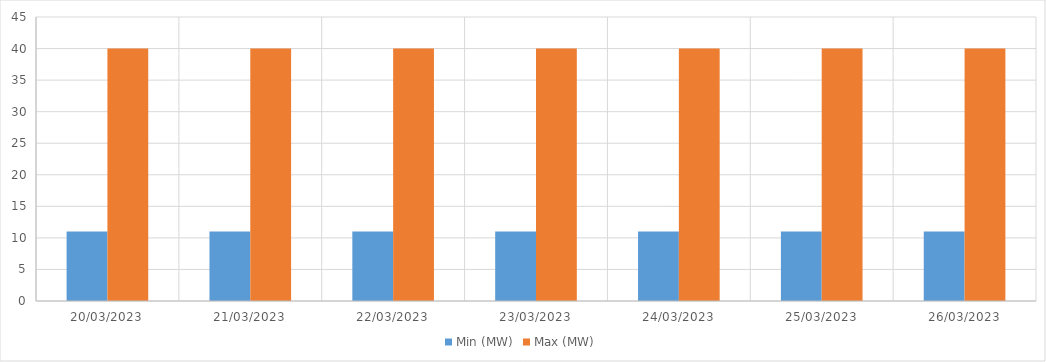
| Category | Min (MW) | Max (MW) |
|---|---|---|
| 20/03/2023 | 11 | 40 |
| 21/03/2023 | 11 | 40 |
| 22/03/2023 | 11 | 40 |
| 23/03/2023 | 11 | 40 |
| 24/03/2023 | 11 | 40 |
| 25/03/2023 | 11 | 40 |
| 26/03/2023 | 11 | 40 |